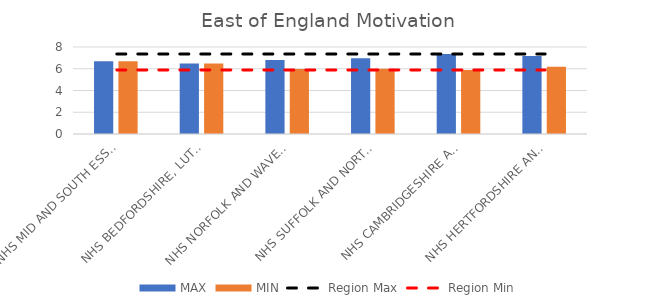
| Category | MAX | MIN |
|---|---|---|
| NHS MID AND SOUTH ESSEX INTEGRATED CARE BOARD | 6.694 | 6.694 |
| NHS BEDFORDSHIRE, LUTON AND MILTON KEYNES INTEGRATED CARE BOARD | 6.483 | 6.483 |
| NHS NORFOLK AND WAVENEY INTEGRATED CARE BOARD | 6.799 | 5.983 |
| NHS SUFFOLK AND NORTH EAST ESSEX INTEGRATED CARE BOARD | 6.963 | 5.993 |
| NHS CAMBRIDGESHIRE AND PETERBOROUGH INTEGRATED CARE BOARD | 7.358 | 5.889 |
| NHS HERTFORDSHIRE AND WEST ESSEX INTEGRATED CARE BOARD | 7.165 | 6.177 |